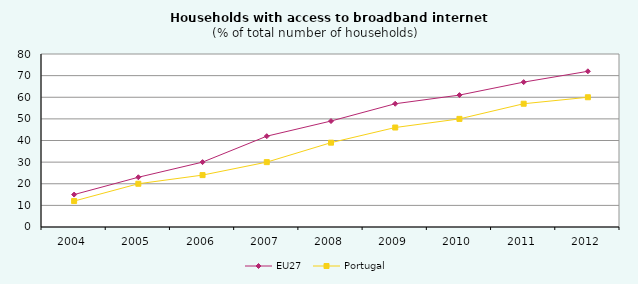
| Category | EU27 | Portugal |
|---|---|---|
| 2004 | 15 | 12 |
| 2005 | 23 | 20 |
| 2006 | 30 | 24 |
| 2007 | 42 | 30 |
| 2008 | 49 | 39 |
| 2009 | 57 | 46 |
| 2010 | 61 | 50 |
| 2011 | 67 | 57 |
| 2012 | 72 | 60 |